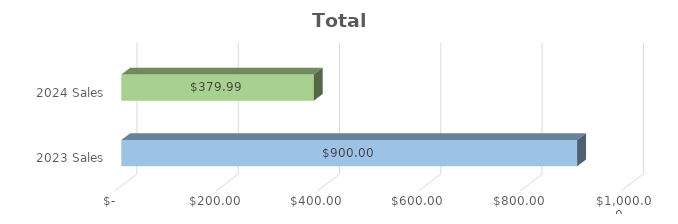
| Category | Total |
|---|---|
| 2023 Sales | 900 |
| 2024 Sales | 379.99 |